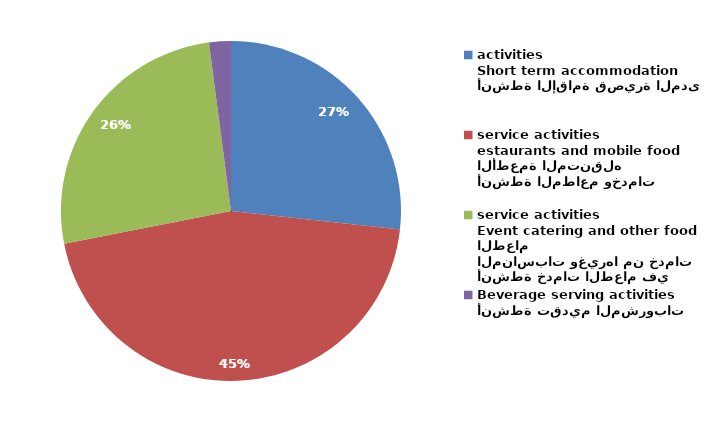
| Category | Series 0 |
|---|---|
| أنشطة الإقامة قصيرة المدى
Short term accommodation activities | 19499 |
| أنشطة المطاعم وخدمات الأطعمة المتنقله
estaurants and mobile food service activities | 32950 |
| أنشطة خدمات الطعام في المناسبات وغيرها من خدمات الطعام
Event catering and other food service activities | 18960 |
| أنشطة تقديم المشروبات
Beverage serving activities | 1513 |